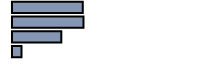
| Category | Series 0 |
|---|---|
| 0 | 35.206 |
| 1 | 35.562 |
| 2 | 24.529 |
| 3 | 4.703 |